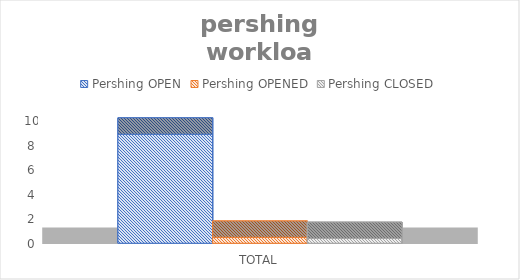
| Category | Pershing |
|---|---|
| TOTAL | 0.388 |